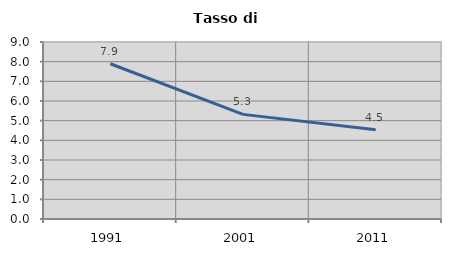
| Category | Tasso di disoccupazione   |
|---|---|
| 1991.0 | 7.893 |
| 2001.0 | 5.32 |
| 2011.0 | 4.544 |